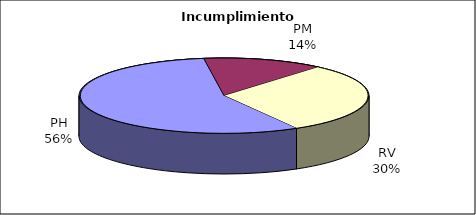
| Category | Valores |
|---|---|
| PH | 290 |
| PM | 70 |
| RV | 157 |